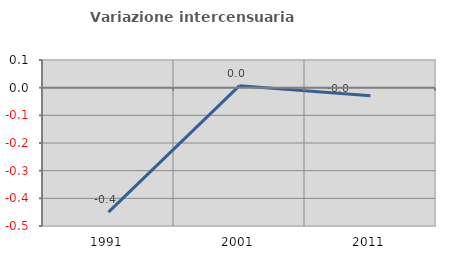
| Category | Variazione intercensuaria annua |
|---|---|
| 1991.0 | -0.45 |
| 2001.0 | 0.007 |
| 2011.0 | -0.029 |